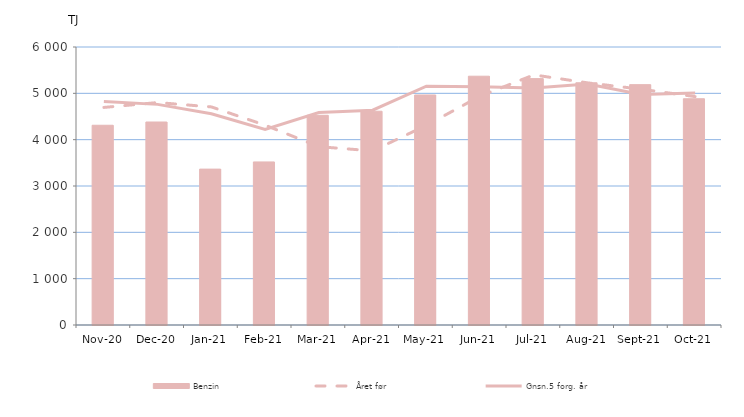
| Category | Benzin |
|---|---|
| 2020-11-01 | 4310.84 |
| 2020-12-01 | 4381.172 |
| 2021-01-01 | 3364.53 |
| 2021-02-01 | 3519.615 |
| 2021-03-01 | 4525.646 |
| 2021-04-01 | 4613.684 |
| 2021-05-01 | 4964.785 |
| 2021-06-01 | 5369.562 |
| 2021-07-01 | 5317.561 |
| 2021-08-01 | 5228.11 |
| 2021-09-01 | 5187.475 |
| 2021-10-01 | 4883.317 |